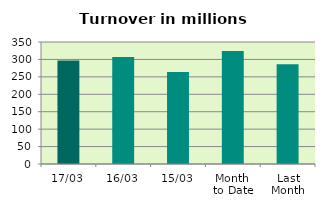
| Category | Series 0 |
|---|---|
| 17/03 | 296.875 |
| 16/03 | 306.984 |
| 15/03 | 263.757 |
| Month 
to Date | 324.211 |
| Last
Month | 285.972 |